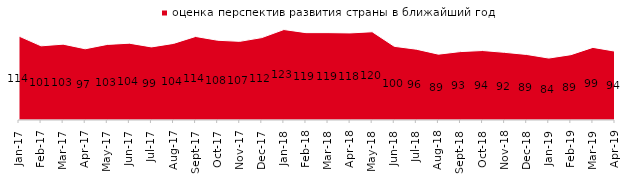
| Category | оценка перспектив развития страны в ближайший год |
|---|---|
| 2017-01-01 | 114 |
| 2017-02-01 | 100.75 |
| 2017-03-01 | 103.05 |
| 2017-04-01 | 96.75 |
| 2017-05-01 | 102.7 |
| 2017-06-01 | 104.35 |
| 2017-07-01 | 99.3 |
| 2017-08-01 | 104.05 |
| 2017-09-01 | 113.5 |
| 2017-10-01 | 108.35 |
| 2017-11-01 | 106.85 |
| 2017-12-01 | 111.95 |
| 2018-01-01 | 122.9 |
| 2018-02-01 | 118.7 |
| 2018-03-01 | 118.7 |
| 2018-04-01 | 118.3 |
| 2018-05-01 | 119.9 |
| 2018-06-01 | 100.1 |
| 2018-07-01 | 96.2 |
| 2018-08-01 | 89.45 |
| 2018-09-01 | 92.95 |
| 2018-10-01 | 94.4 |
| 2018-11-01 | 91.916 |
| 2018-12-01 | 89.05 |
| 2019-01-01 | 84.15 |
| 2019-02-01 | 88.75 |
| 2019-03-01 | 98.657 |
| 2019-04-01 | 93.515 |